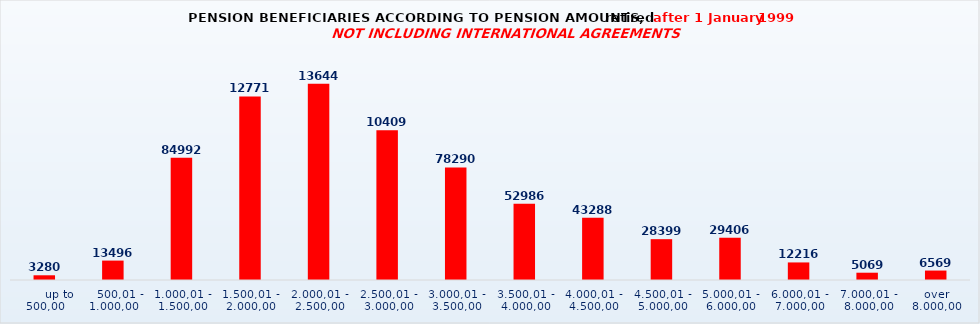
| Category | Series 0 |
|---|---|
|       up to 500,00 | 3280 |
|    500,01 - 1.000,00 | 13496 |
| 1.000,01 - 1.500,00 | 84992 |
| 1.500,01 - 2.000,00 | 127712 |
| 2.000,01 - 2.500,00 | 136449 |
| 2.500,01 - 3.000,00 | 104092 |
| 3.000,01 - 3.500,00 | 78290 |
| 3.500,01 - 4.000,00 | 52986 |
| 4.000,01 - 4.500,00 | 43288 |
| 4.500,01 - 5.000,00 | 28399 |
| 5.000,01 - 6.000,00 | 29406 |
| 6.000,01 - 7.000,00 | 12216 |
| 7.000,01 - 8.000,00 | 5069 |
| over 8.000,00 | 6569 |